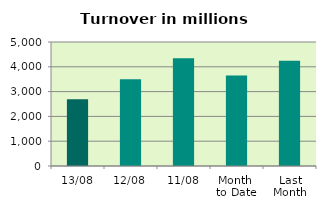
| Category | Series 0 |
|---|---|
| 13/08 | 2691.219 |
| 12/08 | 3497.611 |
| 11/08 | 4346.559 |
| Month 
to Date | 3644.937 |
| Last
Month | 4246.231 |